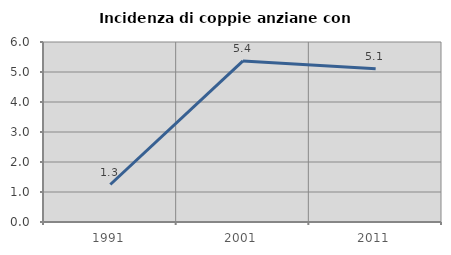
| Category | Incidenza di coppie anziane con figli |
|---|---|
| 1991.0 | 1.25 |
| 2001.0 | 5.369 |
| 2011.0 | 5.109 |